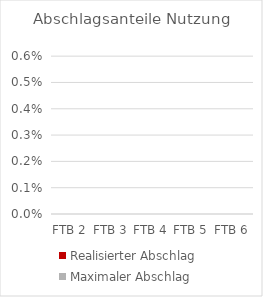
| Category | Realisierter Abschlag | Maximaler Abschlag |
|---|---|---|
| FTB 2 | 0 | 0 |
| FTB 3 | 0 | 0 |
| FTB 4 | 0 | 0 |
| FTB 5 | 0 | 0 |
| FTB 6 | 0 | 0 |